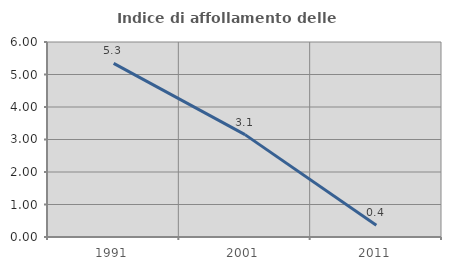
| Category | Indice di affollamento delle abitazioni  |
|---|---|
| 1991.0 | 5.344 |
| 2001.0 | 3.15 |
| 2011.0 | 0.358 |